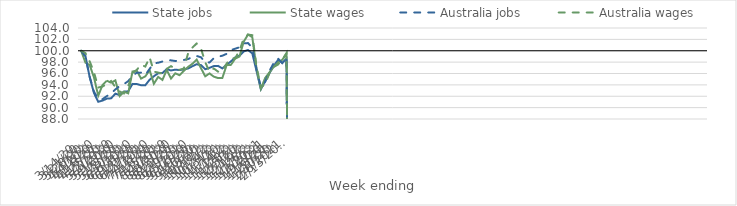
| Category | State jobs | State wages | Australia jobs | Australia wages |
|---|---|---|---|---|
| 14/03/2020 | 100 | 100 | 100 | 100 |
| 21/03/2020 | 99.127 | 97.928 | 98.956 | 99.592 |
| 28/03/2020 | 95.34 | 97.472 | 95.411 | 98.113 |
| 04/04/2020 | 92.562 | 95.309 | 92.812 | 96.235 |
| 11/04/2020 | 91.03 | 92.091 | 91.52 | 93.527 |
| 18/04/2020 | 91.237 | 93.981 | 91.496 | 93.723 |
| 25/04/2020 | 91.581 | 94.732 | 92.021 | 94.131 |
| 02/05/2020 | 91.635 | 94.367 | 92.516 | 94.682 |
| 09/05/2020 | 92.452 | 94.798 | 93.196 | 93.605 |
| 16/05/2020 | 92.204 | 92.04 | 93.786 | 92.839 |
| 23/05/2020 | 92.811 | 92.802 | 94.144 | 92.494 |
| 30/05/2020 | 92.865 | 92.512 | 94.649 | 93.8 |
| 06/06/2020 | 94.175 | 96.35 | 95.633 | 95.98 |
| 13/06/2020 | 94.153 | 96.502 | 96.135 | 96.637 |
| 20/06/2020 | 93.937 | 95.109 | 96.155 | 97.543 |
| 27/06/2020 | 93.939 | 95.493 | 95.736 | 97.22 |
| 04/07/2020 | 94.904 | 96.61 | 96.811 | 98.854 |
| 11/07/2020 | 95.516 | 94.19 | 97.797 | 96.324 |
| 18/07/2020 | 96.049 | 95.405 | 97.892 | 96.165 |
| 25/07/2020 | 96.082 | 94.871 | 98.105 | 95.98 |
| 01/08/2020 | 96.766 | 96.634 | 98.318 | 96.817 |
| 08/08/2020 | 96.533 | 95.111 | 98.31 | 97.297 |
| 15/08/2020 | 96.679 | 96.033 | 98.2 | 96.802 |
| 22/08/2020 | 96.601 | 95.7 | 98.249 | 96.652 |
| 29/08/2020 | 96.707 | 96.476 | 98.38 | 96.868 |
| 05/09/2020 | 96.886 | 97.158 | 98.54 | 99.571 |
| 12/09/2020 | 97.278 | 97.71 | 98.935 | 100.548 |
| 19/09/2020 | 97.632 | 98.444 | 99.081 | 101.275 |
| 26/09/2020 | 97.482 | 96.951 | 98.859 | 100.413 |
| 03/10/2020 | 96.744 | 95.508 | 97.958 | 97.98 |
| 10/10/2020 | 96.994 | 96.016 | 97.945 | 96.303 |
| 17/10/2020 | 97.304 | 95.451 | 98.678 | 96.878 |
| 24/10/2020 | 97.34 | 95.199 | 98.932 | 96.325 |
| 31/10/2020 | 96.892 | 95.211 | 99.127 | 96.446 |
| 07/11/2020 | 97.551 | 97.47 | 99.458 | 97.753 |
| 14/11/2020 | 98.118 | 97.517 | 100.12 | 98.654 |
| 21/11/2020 | 98.827 | 98.614 | 100.358 | 98.686 |
| 28/11/2020 | 99.122 | 98.988 | 100.609 | 100.004 |
| 05/12/2020 | 99.893 | 101.601 | 101.271 | 102.199 |
| 12/12/2020 | 100.125 | 102.843 | 101.353 | 102.847 |
| 19/12/2020 | 99.54 | 102.388 | 100.515 | 102.738 |
| 26/12/2020 | 96.427 | 96.831 | 96.696 | 97.23 |
| 02/01/2021 | 93.231 | 93.313 | 93.609 | 93.51 |
| 09/01/2021 | 94.635 | 95.216 | 94.526 | 94.153 |
| 16/01/2021 | 96.056 | 96.194 | 96.434 | 96.036 |
| 23/01/2021 | 97.324 | 97.184 | 97.839 | 97.148 |
| 30/01/2021 | 98.364 | 97.939 | 98.639 | 97.559 |
| 06/02/2021 | 97.865 | 98.407 | 97.828 | 98.431 |
| 13/02/2021 | 98.619 | 99.442 | 98.686 | 99.61 |